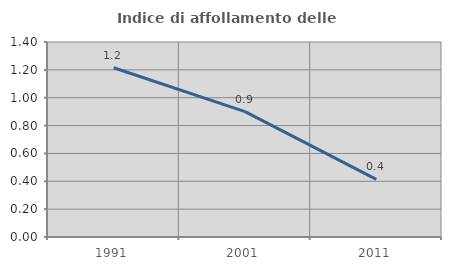
| Category | Indice di affollamento delle abitazioni  |
|---|---|
| 1991.0 | 1.215 |
| 2001.0 | 0.9 |
| 2011.0 | 0.413 |